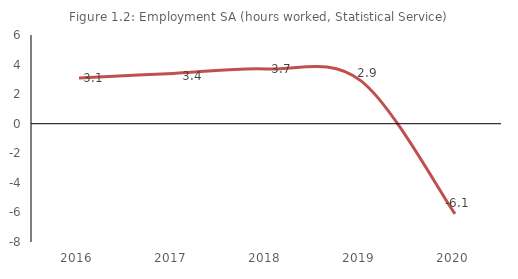
| Category | Employment SA (hours worked, Statistical Service) |
|---|---|
| 2016.0 | 3.1 |
| 2017.0 | 3.4 |
| 2018.0 | 3.7 |
| 2019.0 | 2.9 |
| 2020.0 | -6.1 |